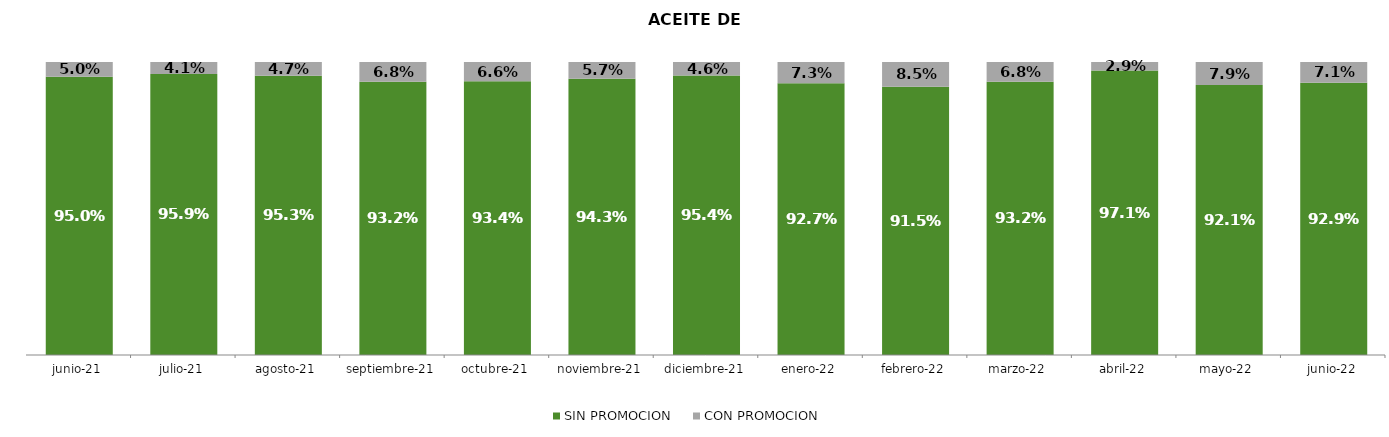
| Category | SIN PROMOCION   | CON PROMOCION   |
|---|---|---|
| 2021-06-01 | 0.95 | 0.05 |
| 2021-07-01 | 0.959 | 0.041 |
| 2021-08-01 | 0.953 | 0.047 |
| 2021-09-01 | 0.932 | 0.068 |
| 2021-10-01 | 0.934 | 0.066 |
| 2021-11-01 | 0.943 | 0.057 |
| 2021-12-01 | 0.954 | 0.046 |
| 2022-01-01 | 0.927 | 0.073 |
| 2022-02-01 | 0.915 | 0.085 |
| 2022-03-01 | 0.932 | 0.068 |
| 2022-04-01 | 0.971 | 0.029 |
| 2022-05-01 | 0.921 | 0.079 |
| 2022-06-01 | 0.929 | 0.071 |